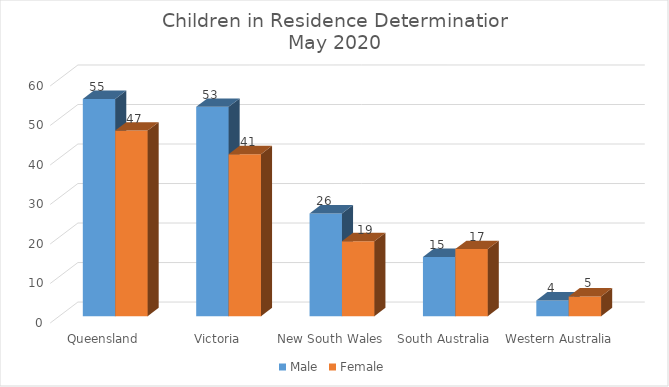
| Category | Male | Female |
|---|---|---|
| Queensland  | 55 | 47 |
| Victoria  | 53 | 41 |
| New South Wales  | 26 | 19 |
| South Australia  | 15 | 17 |
| Western Australia  | 4 | 5 |